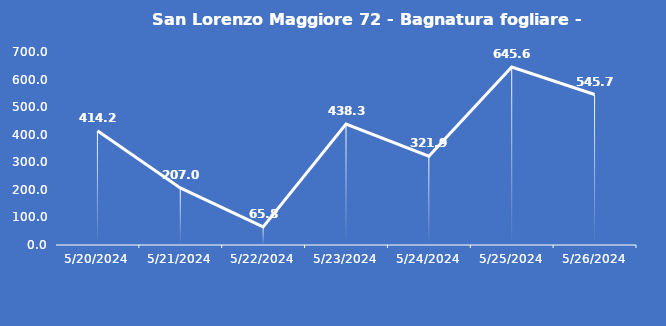
| Category | San Lorenzo Maggiore 72 - Bagnatura fogliare - Grezzo (min) |
|---|---|
| 5/20/24 | 414.2 |
| 5/21/24 | 207 |
| 5/22/24 | 65.8 |
| 5/23/24 | 438.3 |
| 5/24/24 | 321.9 |
| 5/25/24 | 645.6 |
| 5/26/24 | 545.7 |